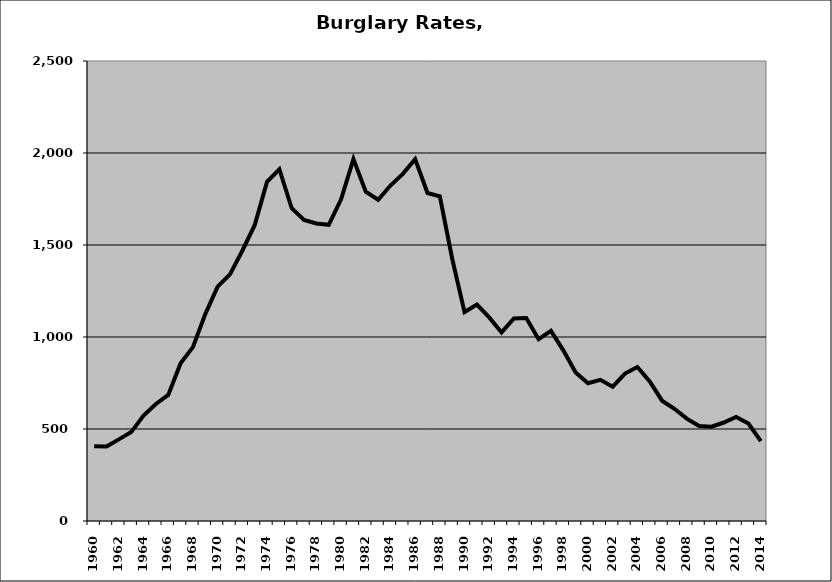
| Category | Burglary |
|---|---|
| 1960.0 | 405.668 |
| 1961.0 | 404.447 |
| 1962.0 | 443.562 |
| 1963.0 | 483.187 |
| 1964.0 | 573.33 |
| 1965.0 | 636.072 |
| 1966.0 | 685.115 |
| 1967.0 | 857.429 |
| 1968.0 | 945.12 |
| 1969.0 | 1124.656 |
| 1970.0 | 1273.415 |
| 1971.0 | 1340.732 |
| 1972.0 | 1468.79 |
| 1973.0 | 1607.73 |
| 1974.0 | 1843.16 |
| 1975.0 | 1911.626 |
| 1976.0 | 1699.742 |
| 1977.0 | 1636.364 |
| 1978.0 | 1617.144 |
| 1979.0 | 1609.893 |
| 1980.0 | 1748.378 |
| 1981.0 | 1967.019 |
| 1982.0 | 1789.732 |
| 1983.0 | 1745.755 |
| 1984.0 | 1823.298 |
| 1985.0 | 1886.491 |
| 1986.0 | 1966.716 |
| 1987.0 | 1782.746 |
| 1988.0 | 1764.137 |
| 1989.0 | 1425.426 |
| 1990.0 | 1135.445 |
| 1991.0 | 1176.01 |
| 1992.0 | 1106.651 |
| 1993.0 | 1024.802 |
| 1994.0 | 1100.778 |
| 1995.0 | 1102.833 |
| 1996.0 | 988.265 |
| 1997.0 | 1033.21 |
| 1998.0 | 927.544 |
| 1999.0 | 806.627 |
| 2000.0 | 748.758 |
| 2001.0 | 767.193 |
| 2002.0 | 729.926 |
| 2003.0 | 801.329 |
| 2004.0 | 837.342 |
| 2005.0 | 759.054 |
| 2006.0 | 653.839 |
| 2007.0 | 610.014 |
| 2008.0 | 556.517 |
| 2009.0 | 515.964 |
| 2010.0 | 512.572 |
| 2011.0 | 535.232 |
| 2012.0 | 565.439 |
| 2013.0 | 529.726 |
| 2014.0 | 433.979 |